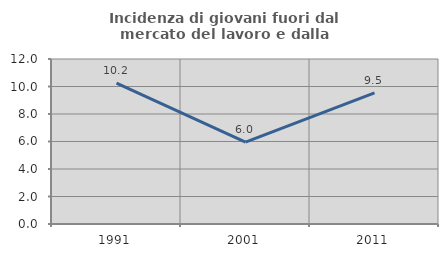
| Category | Incidenza di giovani fuori dal mercato del lavoro e dalla formazione  |
|---|---|
| 1991.0 | 10.244 |
| 2001.0 | 5.955 |
| 2011.0 | 9.533 |